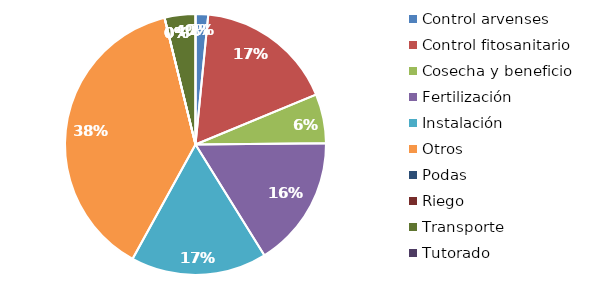
| Category | Valor |
|---|---|
| Control arvenses | 271244 |
| Control fitosanitario | 2986617 |
| Cosecha y beneficio | 1061267.606 |
| Fertilización | 2829829 |
| Instalación | 2927655 |
| Otros | 6632925 |
| Podas | 0 |
| Riego | 0 |
| Transporte | 663292 |
| Tutorado | 0 |